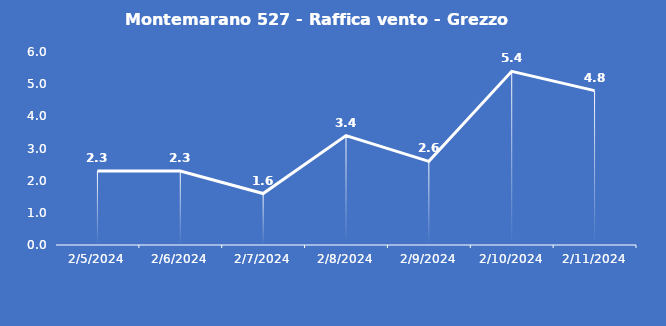
| Category | Montemarano 527 - Raffica vento - Grezzo (m/s) |
|---|---|
| 2/5/24 | 2.3 |
| 2/6/24 | 2.3 |
| 2/7/24 | 1.6 |
| 2/8/24 | 3.4 |
| 2/9/24 | 2.6 |
| 2/10/24 | 5.4 |
| 2/11/24 | 4.8 |